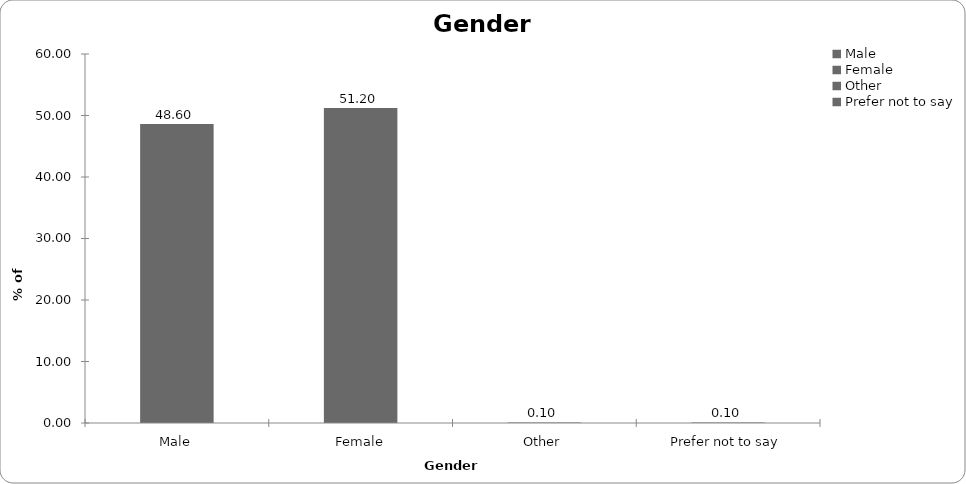
| Category | Series 0 |
|---|---|
| Male | 48.6 |
| Female | 51.2 |
| Other | 0.1 |
| Prefer not to say | 0.1 |